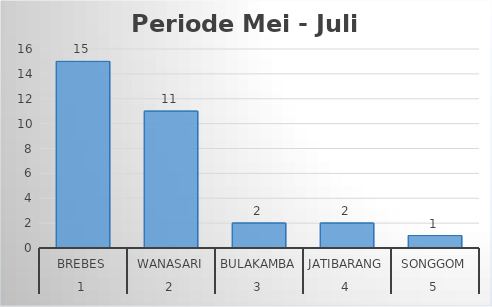
| Category | Series 0 |
|---|---|
| 0 | 15 |
| 1 | 11 |
| 2 | 2 |
| 3 | 2 |
| 4 | 1 |